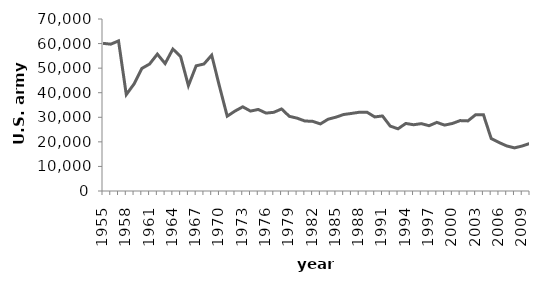
| Category | Series 0 |
|---|---|
| 1955.0 | 60096 |
| 1956.0 | 59755 |
| 1957.0 | 61087 |
| 1958.0 | 39224 |
| 1959.0 | 43562 |
| 1960.0 | 49882 |
| 1961.0 | 51674 |
| 1962.0 | 55707 |
| 1963.0 | 51861 |
| 1964.0 | 57786 |
| 1965.0 | 54673 |
| 1966.0 | 42886 |
| 1967.0 | 50946 |
| 1968.0 | 51686 |
| 1969.0 | 55284 |
| 1970.0 | 42629 |
| 1971.0 | 30453 |
| 1972.0 | 32526 |
| 1973.0 | 34258 |
| 1974.0 | 32528 |
| 1975.0 | 33186 |
| 1976.0 | 31703 |
| 1977.0 | 32024 |
| 1978.0 | 33393 |
| 1979.0 | 30389 |
| 1980.0 | 29647 |
| 1981.0 | 28486 |
| 1982.0 | 28359 |
| 1983.0 | 27304 |
| 1984.0 | 29221 |
| 1985.0 | 30051 |
| 1986.0 | 31132 |
| 1987.0 | 31567 |
| 1988.0 | 32044 |
| 1989.0 | 32072 |
| 1990.0 | 30150 |
| 1991.0 | 30536 |
| 1992.0 | 26402 |
| 1993.0 | 25316 |
| 1994.0 | 27486 |
| 1995.0 | 26967 |
| 1996.0 | 27416 |
| 1997.0 | 26576 |
| 1998.0 | 27918 |
| 1999.0 | 26817 |
| 2000.0 | 27481 |
| 2001.0 | 28654 |
| 2002.0 | 28527 |
| 2003.0 | 31046 |
| 2004.0 | 31067 |
| 2005.0 | 21372 |
| 2006.0 | 19755 |
| 2007.0 | 18344 |
| 2008.0 | 17551 |
| 2009.0 | 18317 |
| 2010.0 | 19375 |